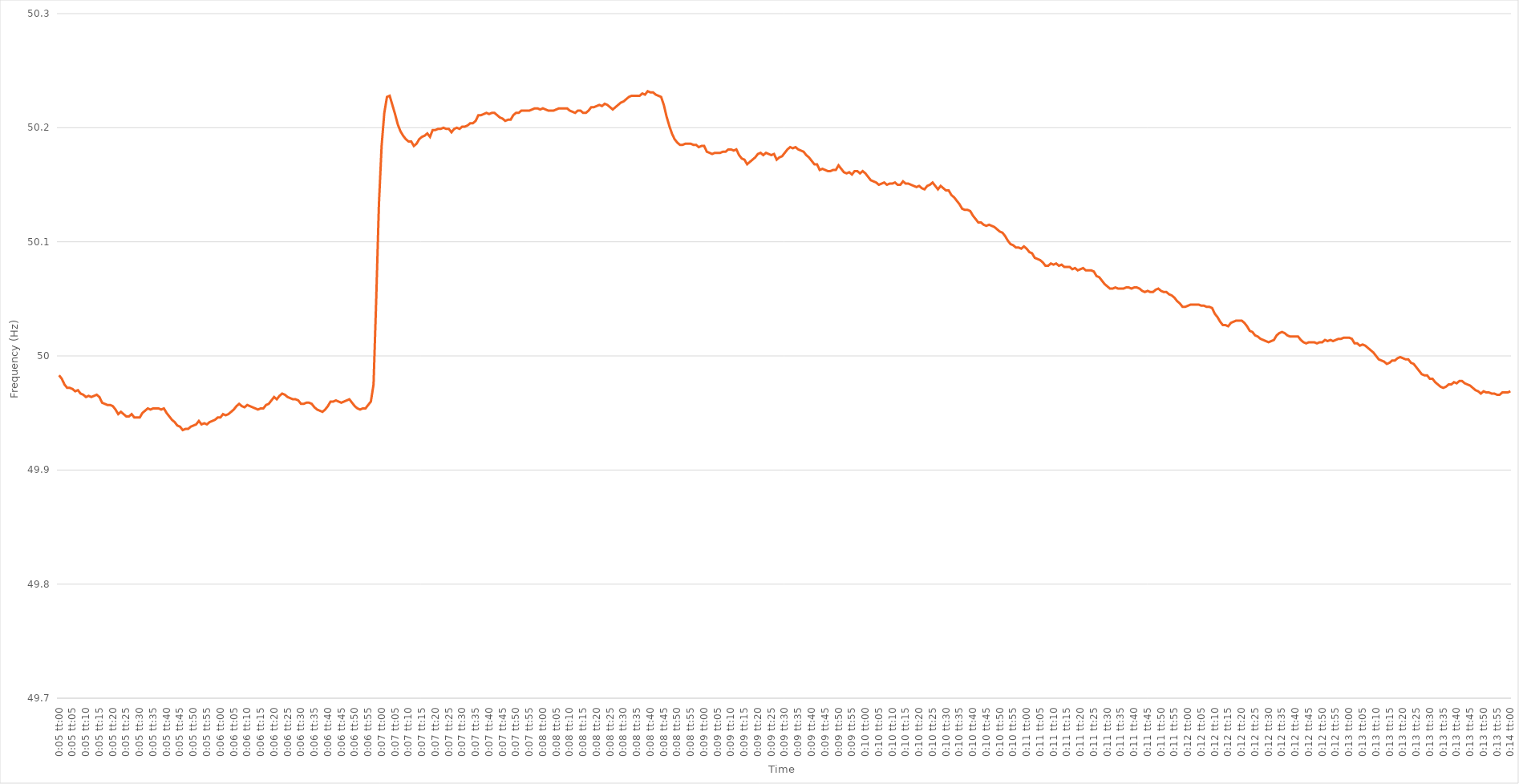
| Category | Series 0 |
|---|---|
| 0.003472222222222222 | 49.983 |
| 0.003483796296296296 | 49.98 |
| 0.0034953703703703705 | 49.975 |
| 0.0035069444444444445 | 49.972 |
| 0.0035185185185185185 | 49.972 |
| 0.003530092592592592 | 49.971 |
| 0.0035416666666666665 | 49.969 |
| 0.0035532407407407405 | 49.97 |
| 0.0035648148148148154 | 49.967 |
| 0.0035763888888888894 | 49.966 |
| 0.003587962962962963 | 49.964 |
| 0.003599537037037037 | 49.965 |
| 0.0036111111111111114 | 49.964 |
| 0.0036226851851851854 | 49.965 |
| 0.0036342592592592594 | 49.966 |
| 0.003645833333333333 | 49.964 |
| 0.0036574074074074074 | 49.959 |
| 0.0036689814814814814 | 49.958 |
| 0.0036805555555555554 | 49.957 |
| 0.00369212962962963 | 49.957 |
| 0.0037037037037037034 | 49.956 |
| 0.0037152777777777774 | 49.953 |
| 0.0037268518518518514 | 49.949 |
| 0.0037384259259259263 | 49.951 |
| 0.0037500000000000003 | 49.949 |
| 0.003761574074074074 | 49.947 |
| 0.0037731481481481483 | 49.947 |
| 0.0037847222222222223 | 49.949 |
| 0.0037962962962962963 | 49.946 |
| 0.0038078703703703707 | 49.946 |
| 0.0038194444444444443 | 49.946 |
| 0.0038310185185185183 | 49.95 |
| 0.0038425925925925923 | 49.952 |
| 0.0038541666666666668 | 49.954 |
| 0.0038657407407407408 | 49.953 |
| 0.0038773148148148143 | 49.954 |
| 0.0038888888888888883 | 49.954 |
| 0.003900462962962963 | 49.954 |
| 0.003912037037037037 | 49.953 |
| 0.003923611111111111 | 49.954 |
| 0.003935185185185186 | 49.95 |
| 0.003946759259259259 | 49.947 |
| 0.003958333333333334 | 49.944 |
| 0.003969907407407407 | 49.942 |
| 0.003981481481481482 | 49.939 |
| 0.003993055555555556 | 49.938 |
| 0.00400462962962963 | 49.935 |
| 0.004016203703703703 | 49.936 |
| 0.004027777777777778 | 49.936 |
| 0.004039351851851852 | 49.938 |
| 0.004050925925925926 | 49.939 |
| 0.004062499999999999 | 49.94 |
| 0.004074074074074075 | 49.943 |
| 0.004085648148148148 | 49.94 |
| 0.004097222222222223 | 49.941 |
| 0.004108796296296297 | 49.94 |
| 0.004120370370370371 | 49.942 |
| 0.004131944444444444 | 49.943 |
| 0.004143518518518519 | 49.944 |
| 0.004155092592592593 | 49.946 |
| 0.004166666666666667 | 49.946 |
| 0.00417824074074074 | 49.949 |
| 0.004189814814814815 | 49.948 |
| 0.004201388888888889 | 49.949 |
| 0.004212962962962963 | 49.951 |
| 0.004224537037037037 | 49.953 |
| 0.004236111111111111 | 49.956 |
| 0.004247685185185185 | 49.958 |
| 0.0042592592592592595 | 49.956 |
| 0.004270833333333334 | 49.955 |
| 0.0042824074074074075 | 49.957 |
| 0.004293981481481481 | 49.956 |
| 0.0043055555555555555 | 49.955 |
| 0.00431712962962963 | 49.954 |
| 0.0043287037037037035 | 49.953 |
| 0.004340277777777778 | 49.954 |
| 0.0043518518518518515 | 49.954 |
| 0.004363425925925926 | 49.957 |
| 0.0043749999999999995 | 49.958 |
| 0.004386574074074074 | 49.961 |
| 0.004398148148148148 | 49.964 |
| 0.004409722222222222 | 49.962 |
| 0.0044212962962962956 | 49.965 |
| 0.004432870370370371 | 49.967 |
| 0.0044444444444444444 | 49.966 |
| 0.004456018518518519 | 49.964 |
| 0.004467592592592593 | 49.963 |
| 0.004479166666666667 | 49.962 |
| 0.0044907407407407405 | 49.962 |
| 0.004502314814814815 | 49.961 |
| 0.004513888888888889 | 49.958 |
| 0.004525462962962963 | 49.958 |
| 0.0045370370370370365 | 49.959 |
| 0.004548611111111111 | 49.959 |
| 0.004560185185185185 | 49.958 |
| 0.004571759259259259 | 49.955 |
| 0.004583333333333333 | 49.953 |
| 0.004594907407407408 | 49.952 |
| 0.004606481481481481 | 49.951 |
| 0.004618055555555556 | 49.953 |
| 0.00462962962962963 | 49.956 |
| 0.004641203703703704 | 49.96 |
| 0.004652777777777777 | 49.96 |
| 0.004664351851851852 | 49.961 |
| 0.004675925925925926 | 49.96 |
| 0.0046875 | 49.959 |
| 0.004699074074074074 | 49.96 |
| 0.004710648148148148 | 49.961 |
| 0.004722222222222222 | 49.962 |
| 0.004733796296296296 | 49.959 |
| 0.00474537037037037 | 49.956 |
| 0.004756944444444445 | 49.954 |
| 0.004768518518518518 | 49.953 |
| 0.004780092592592592 | 49.954 |
| 0.004791666666666667 | 49.954 |
| 0.004803240740740741 | 49.957 |
| 0.004814814814814815 | 49.96 |
| 0.004826388888888889 | 49.975 |
| 0.004837962962962963 | 50.05 |
| 0.004849537037037037 | 50.133 |
| 0.004861111111111111 | 50.184 |
| 0.004872685185185186 | 50.213 |
| 0.004884259259259259 | 50.227 |
| 0.004895833333333333 | 50.228 |
| 0.004907407407407407 | 50.22 |
| 0.004918981481481482 | 50.212 |
| 0.004930555555555555 | 50.203 |
| 0.004942129629629629 | 50.197 |
| 0.004953703703703704 | 50.193 |
| 0.004965277777777778 | 50.19 |
| 0.004976851851851852 | 50.188 |
| 0.0049884259259259265 | 50.188 |
| 0.005 | 50.184 |
| 0.005011574074074074 | 50.186 |
| 0.005023148148148148 | 50.19 |
| 0.0050347222222222225 | 50.192 |
| 0.005046296296296296 | 50.193 |
| 0.0050578703703703706 | 50.195 |
| 0.005069444444444444 | 50.192 |
| 0.0050810185185185186 | 50.198 |
| 0.005092592592592592 | 50.198 |
| 0.005104166666666667 | 50.199 |
| 0.005115740740740741 | 50.199 |
| 0.005127314814814815 | 50.2 |
| 0.005138888888888889 | 50.199 |
| 0.0051504629629629635 | 50.199 |
| 0.005162037037037037 | 50.196 |
| 0.0051736111111111115 | 50.199 |
| 0.005185185185185185 | 50.2 |
| 0.0051967592592592595 | 50.199 |
| 0.005208333333333333 | 50.201 |
| 0.005219907407407407 | 50.201 |
| 0.005231481481481482 | 50.202 |
| 0.0052430555555555555 | 50.204 |
| 0.00525462962962963 | 50.204 |
| 0.0052662037037037035 | 50.206 |
| 0.005277777777777777 | 50.211 |
| 0.0052893518518518515 | 50.211 |
| 0.005300925925925925 | 50.212 |
| 0.0053125 | 50.213 |
| 0.005324074074074075 | 50.212 |
| 0.005335648148148148 | 50.213 |
| 0.005347222222222222 | 50.213 |
| 0.005358796296296296 | 50.211 |
| 0.00537037037037037 | 50.209 |
| 0.005381944444444445 | 50.208 |
| 0.005393518518518519 | 50.206 |
| 0.005405092592592592 | 50.207 |
| 0.005416666666666667 | 50.207 |
| 0.00542824074074074 | 50.211 |
| 0.005439814814814815 | 50.213 |
| 0.005451388888888888 | 50.213 |
| 0.005462962962962964 | 50.215 |
| 0.005474537037037037 | 50.215 |
| 0.005486111111111112 | 50.215 |
| 0.005497685185185185 | 50.215 |
| 0.005509259259259259 | 50.216 |
| 0.005520833333333333 | 50.217 |
| 0.005532407407407407 | 50.217 |
| 0.005543981481481482 | 50.216 |
| 0.005555555555555556 | 50.217 |
| 0.00556712962962963 | 50.216 |
| 0.005578703703703704 | 50.215 |
| 0.005590277777777778 | 50.215 |
| 0.005601851851851852 | 50.215 |
| 0.005613425925925927 | 50.216 |
| 0.005624999999999999 | 50.217 |
| 0.005636574074074074 | 50.217 |
| 0.005648148148148148 | 50.217 |
| 0.005659722222222222 | 50.217 |
| 0.005671296296296296 | 50.215 |
| 0.00568287037037037 | 50.214 |
| 0.005694444444444444 | 50.213 |
| 0.005706018518518519 | 50.215 |
| 0.005717592592592593 | 50.215 |
| 0.005729166666666667 | 50.213 |
| 0.005740740740740742 | 50.213 |
| 0.005752314814814814 | 50.215 |
| 0.005763888888888889 | 50.218 |
| 0.005775462962962962 | 50.218 |
| 0.005787037037037038 | 50.219 |
| 0.005798611111111111 | 50.22 |
| 0.005810185185185186 | 50.219 |
| 0.005821759259259259 | 50.221 |
| 0.005833333333333334 | 50.22 |
| 0.005844907407407407 | 50.218 |
| 0.0058564814814814825 | 50.216 |
| 0.005868055555555554 | 50.218 |
| 0.00587962962962963 | 50.22 |
| 0.005891203703703703 | 50.222 |
| 0.005902777777777778 | 50.223 |
| 0.005914351851851852 | 50.225 |
| 0.005925925925925926 | 50.227 |
| 0.005937500000000001 | 50.228 |
| 0.0059490740740740745 | 50.228 |
| 0.005960648148148149 | 50.228 |
| 0.0059722222222222225 | 50.228 |
| 0.005983796296296296 | 50.23 |
| 0.00599537037037037 | 50.229 |
| 0.006006944444444444 | 50.232 |
| 0.006018518518518518 | 50.231 |
| 0.006030092592592593 | 50.231 |
| 0.0060416666666666665 | 50.229 |
| 0.006053240740740741 | 50.228 |
| 0.0060648148148148145 | 50.227 |
| 0.006076388888888889 | 50.22 |
| 0.006087962962962964 | 50.21 |
| 0.006099537037037036 | 50.202 |
| 0.006111111111111111 | 50.195 |
| 0.006122685185185185 | 50.19 |
| 0.0061342592592592594 | 50.187 |
| 0.006145833333333333 | 50.185 |
| 0.0061574074074074074 | 50.185 |
| 0.006168981481481481 | 50.186 |
| 0.006180555555555556 | 50.186 |
| 0.00619212962962963 | 50.186 |
| 0.006203703703703704 | 50.185 |
| 0.006215277777777777 | 50.185 |
| 0.0062268518518518515 | 50.183 |
| 0.006238425925925925 | 50.184 |
| 0.0062499999999999995 | 50.184 |
| 0.006261574074074075 | 50.179 |
| 0.006273148148148148 | 50.178 |
| 0.006284722222222223 | 50.177 |
| 0.006296296296296296 | 50.178 |
| 0.006307870370370371 | 50.178 |
| 0.006319444444444444 | 50.178 |
| 0.00633101851851852 | 50.179 |
| 0.0063425925925925915 | 50.179 |
| 0.006354166666666667 | 50.181 |
| 0.00636574074074074 | 50.181 |
| 0.006377314814814815 | 50.18 |
| 0.006388888888888888 | 50.181 |
| 0.006400462962962963 | 50.176 |
| 0.006412037037037036 | 50.173 |
| 0.006423611111111112 | 50.172 |
| 0.006435185185185186 | 50.168 |
| 0.00644675925925926 | 50.17 |
| 0.006458333333333333 | 50.172 |
| 0.006469907407407407 | 50.174 |
| 0.006481481481481481 | 50.177 |
| 0.006493055555555555 | 50.178 |
| 0.00650462962962963 | 50.176 |
| 0.006516203703703704 | 50.178 |
| 0.006527777777777778 | 50.177 |
| 0.006539351851851852 | 50.176 |
| 0.006550925925925926 | 50.177 |
| 0.0065625 | 50.172 |
| 0.006574074074074073 | 50.174 |
| 0.006585648148148147 | 50.175 |
| 0.006597222222222222 | 50.178 |
| 0.006608796296296297 | 50.181 |
| 0.00662037037037037 | 50.183 |
| 0.006631944444444445 | 50.182 |
| 0.006643518518518518 | 50.183 |
| 0.0066550925925925935 | 50.181 |
| 0.006666666666666667 | 50.18 |
| 0.0066782407407407415 | 50.179 |
| 0.006689814814814814 | 50.176 |
| 0.006701388888888889 | 50.174 |
| 0.006712962962962962 | 50.171 |
| 0.006724537037037037 | 50.168 |
| 0.00673611111111111 | 50.168 |
| 0.0067476851851851856 | 50.163 |
| 0.006759259259259259 | 50.164 |
| 0.0067708333333333336 | 50.163 |
| 0.006782407407407408 | 50.162 |
| 0.006793981481481482 | 50.162 |
| 0.006805555555555557 | 50.163 |
| 0.006817129629629629 | 50.163 |
| 0.006828703703703704 | 50.167 |
| 0.006840277777777778 | 50.164 |
| 0.006851851851851852 | 50.161 |
| 0.006863425925925926 | 50.16 |
| 0.006875 | 50.161 |
| 0.006886574074074074 | 50.159 |
| 0.006898148148148149 | 50.162 |
| 0.0069097222222222225 | 50.162 |
| 0.006921296296296297 | 50.16 |
| 0.00693287037037037 | 50.162 |
| 0.006944444444444444 | 50.16 |
| 0.0069560185185185185 | 50.157 |
| 0.006967592592592592 | 50.154 |
| 0.006979166666666667 | 50.153 |
| 0.006990740740740741 | 50.152 |
| 0.007002314814814815 | 50.15 |
| 0.007013888888888889 | 50.151 |
| 0.007025462962962963 | 50.152 |
| 0.007037037037037037 | 50.15 |
| 0.0070486111111111105 | 50.151 |
| 0.007060185185185184 | 50.151 |
| 0.007071759259259259 | 50.152 |
| 0.007083333333333333 | 50.15 |
| 0.007094907407407407 | 50.15 |
| 0.007106481481481481 | 50.153 |
| 0.007118055555555555 | 50.151 |
| 0.007129629629629631 | 50.151 |
| 0.007141203703703704 | 50.15 |
| 0.007152777777777779 | 50.149 |
| 0.0071643518518518514 | 50.148 |
| 0.007175925925925926 | 50.149 |
| 0.0071874999999999994 | 50.147 |
| 0.007199074074074074 | 50.146 |
| 0.0072106481481481475 | 50.149 |
| 0.007222222222222223 | 50.15 |
| 0.007233796296296296 | 50.152 |
| 0.007245370370370371 | 50.149 |
| 0.007256944444444444 | 50.146 |
| 0.007268518518518519 | 50.149 |
| 0.0072800925925925915 | 50.147 |
| 0.007291666666666666 | 50.145 |
| 0.007303240740740741 | 50.145 |
| 0.007314814814814815 | 50.141 |
| 0.007326388888888889 | 50.139 |
| 0.007337962962962963 | 50.136 |
| 0.007349537037037037 | 50.133 |
| 0.007361111111111111 | 50.129 |
| 0.007372685185185186 | 50.128 |
| 0.00738425925925926 | 50.128 |
| 0.007395833333333334 | 50.127 |
| 0.007407407407407407 | 50.123 |
| 0.007418981481481481 | 50.12 |
| 0.007430555555555555 | 50.117 |
| 0.007442129629629629 | 50.117 |
| 0.007453703703703703 | 50.115 |
| 0.007465277777777778 | 50.114 |
| 0.007476851851851853 | 50.115 |
| 0.007488425925925926 | 50.114 |
| 0.007500000000000001 | 50.113 |
| 0.007511574074074074 | 50.111 |
| 0.007523148148148148 | 50.109 |
| 0.007534722222222221 | 50.108 |
| 0.007546296296296297 | 50.105 |
| 0.00755787037037037 | 50.101 |
| 0.007569444444444445 | 50.098 |
| 0.007581018518518518 | 50.097 |
| 0.007592592592592593 | 50.095 |
| 0.007604166666666666 | 50.095 |
| 0.0076157407407407415 | 50.094 |
| 0.007627314814814815 | 50.096 |
| 0.007638888888888889 | 50.094 |
| 0.007650462962962963 | 50.091 |
| 0.007662037037037037 | 50.09 |
| 0.007673611111111111 | 50.086 |
| 0.007685185185185185 | 50.085 |
| 0.00769675925925926 | 50.084 |
| 0.0077083333333333335 | 50.082 |
| 0.007719907407407408 | 50.079 |
| 0.0077314814814814815 | 50.079 |
| 0.007743055555555556 | 50.081 |
| 0.007754629629629629 | 50.08 |
| 0.007766203703703703 | 50.081 |
| 0.007777777777777777 | 50.079 |
| 0.007789351851851852 | 50.08 |
| 0.0078009259259259256 | 50.078 |
| 0.0078125 | 50.078 |
| 0.007824074074074075 | 50.078 |
| 0.007835648148148149 | 50.076 |
| 0.007847222222222222 | 50.077 |
| 0.007858796296296296 | 50.075 |
| 0.007870370370370371 | 50.076 |
| 0.007881944444444443 | 50.077 |
| 0.007893518518518518 | 50.075 |
| 0.007905092592592592 | 50.075 |
| 0.007916666666666667 | 50.075 |
| 0.007928240740740741 | 50.074 |
| 0.007939814814814814 | 50.07 |
| 0.007951388888888888 | 50.069 |
| 0.007962962962962963 | 50.066 |
| 0.007974537037037037 | 50.063 |
| 0.007986111111111112 | 50.061 |
| 0.007997685185185186 | 50.059 |
| 0.00800925925925926 | 50.059 |
| 0.008020833333333333 | 50.06 |
| 0.008032407407407407 | 50.059 |
| 0.008043981481481482 | 50.059 |
| 0.008055555555555555 | 50.059 |
| 0.00806712962962963 | 50.06 |
| 0.008078703703703704 | 50.06 |
| 0.008090277777777778 | 50.059 |
| 0.008101851851851851 | 50.06 |
| 0.008113425925925925 | 50.06 |
| 0.008124999999999999 | 50.059 |
| 0.008136574074074074 | 50.057 |
| 0.008148148148148147 | 50.056 |
| 0.008159722222222223 | 50.057 |
| 0.008171296296296296 | 50.056 |
| 0.00818287037037037 | 50.056 |
| 0.008194444444444445 | 50.058 |
| 0.008206018518518519 | 50.059 |
| 0.008217592592592594 | 50.057 |
| 0.008229166666666666 | 50.056 |
| 0.008240740740740741 | 50.056 |
| 0.008252314814814815 | 50.054 |
| 0.008263888888888888 | 50.053 |
| 0.008275462962962962 | 50.051 |
| 0.008287037037037037 | 50.048 |
| 0.00829861111111111 | 50.046 |
| 0.008310185185185186 | 50.043 |
| 0.00832175925925926 | 50.043 |
| 0.008333333333333333 | 50.044 |
| 0.008344907407407409 | 50.045 |
| 0.00835648148148148 | 50.045 |
| 0.008368055555555556 | 50.045 |
| 0.00837962962962963 | 50.045 |
| 0.008391203703703705 | 50.044 |
| 0.008402777777777778 | 50.044 |
| 0.008414351851851852 | 50.043 |
| 0.008425925925925925 | 50.043 |
| 0.0084375 | 50.042 |
| 0.008449074074074074 | 50.037 |
| 0.00846064814814815 | 50.034 |
| 0.008472222222222221 | 50.03 |
| 0.008483796296296297 | 50.027 |
| 0.00849537037037037 | 50.027 |
| 0.008506944444444444 | 50.026 |
| 0.008518518518518519 | 50.029 |
| 0.008530092592592593 | 50.03 |
| 0.008541666666666668 | 50.031 |
| 0.008553240740740741 | 50.031 |
| 0.008564814814814815 | 50.031 |
| 0.008576388888888889 | 50.029 |
| 0.008587962962962962 | 50.026 |
| 0.008599537037037036 | 50.022 |
| 0.008611111111111111 | 50.021 |
| 0.008622685185185185 | 50.018 |
| 0.00863425925925926 | 50.017 |
| 0.008645833333333333 | 50.015 |
| 0.008657407407407407 | 50.014 |
| 0.00866898148148148 | 50.013 |
| 0.008680555555555556 | 50.012 |
| 0.008692129629629631 | 50.013 |
| 0.008703703703703703 | 50.014 |
| 0.008715277777777778 | 50.018 |
| 0.008726851851851852 | 50.02 |
| 0.008738425925925926 | 50.021 |
| 0.008749999999999999 | 50.02 |
| 0.008761574074074074 | 50.018 |
| 0.008773148148148148 | 50.017 |
| 0.008784722222222223 | 50.017 |
| 0.008796296296296297 | 50.017 |
| 0.00880787037037037 | 50.017 |
| 0.008819444444444444 | 50.014 |
| 0.008831018518518518 | 50.012 |
| 0.008842592592592591 | 50.011 |
| 0.008854166666666666 | 50.012 |
| 0.008865740740740742 | 50.012 |
| 0.008877314814814815 | 50.012 |
| 0.008888888888888889 | 50.011 |
| 0.008900462962962962 | 50.012 |
| 0.008912037037037038 | 50.012 |
| 0.008923611111111111 | 50.014 |
| 0.008935185185185187 | 50.013 |
| 0.008946759259259258 | 50.014 |
| 0.008958333333333334 | 50.013 |
| 0.008969907407407407 | 50.014 |
| 0.008981481481481481 | 50.015 |
| 0.008993055555555554 | 50.015 |
| 0.00900462962962963 | 50.016 |
| 0.009016203703703703 | 50.016 |
| 0.009027777777777779 | 50.016 |
| 0.009039351851851852 | 50.015 |
| 0.009050925925925926 | 50.011 |
| 0.0090625 | 50.011 |
| 0.009074074074074073 | 50.009 |
| 0.009085648148148148 | 50.01 |
| 0.009097222222222222 | 50.009 |
| 0.009108796296296297 | 50.007 |
| 0.00912037037037037 | 50.005 |
| 0.009131944444444444 | 50.003 |
| 0.009143518518518518 | 50 |
| 0.009155092592592593 | 49.997 |
| 0.009166666666666667 | 49.996 |
| 0.00917824074074074 | 49.995 |
| 0.009189814814814814 | 49.993 |
| 0.00920138888888889 | 49.994 |
| 0.009212962962962963 | 49.996 |
| 0.009224537037037036 | 49.996 |
| 0.009236111111111112 | 49.998 |
| 0.009247685185185185 | 49.999 |
| 0.00925925925925926 | 49.998 |
| 0.009270833333333334 | 49.997 |
| 0.009282407407407408 | 49.997 |
| 0.009293981481481481 | 49.994 |
| 0.009305555555555555 | 49.993 |
| 0.009317129629629628 | 49.99 |
| 0.009328703703703704 | 49.987 |
| 0.009340277777777777 | 49.984 |
| 0.009351851851851853 | 49.983 |
| 0.009363425925925926 | 49.983 |
| 0.009375 | 49.98 |
| 0.009386574074074075 | 49.98 |
| 0.009398148148148149 | 49.977 |
| 0.009409722222222224 | 49.975 |
| 0.009421296296296296 | 49.973 |
| 0.009432870370370371 | 49.972 |
| 0.009444444444444445 | 49.973 |
| 0.009456018518518518 | 49.975 |
| 0.009467592592592592 | 49.975 |
| 0.009479166666666667 | 49.977 |
| 0.00949074074074074 | 49.976 |
| 0.009502314814814816 | 49.978 |
| 0.00951388888888889 | 49.978 |
| 0.009525462962962963 | 49.976 |
| 0.009537037037037037 | 49.975 |
| 0.00954861111111111 | 49.974 |
| 0.009560185185185185 | 49.972 |
| 0.009571759259259259 | 49.97 |
| 0.009583333333333334 | 49.969 |
| 0.009594907407407408 | 49.967 |
| 0.009606481481481481 | 49.969 |
| 0.009618055555555555 | 49.968 |
| 0.00962962962962963 | 49.968 |
| 0.009641203703703704 | 49.967 |
| 0.009652777777777777 | 49.967 |
| 0.009664351851851851 | 49.966 |
| 0.009675925925925926 | 49.966 |
| 0.0096875 | 49.968 |
| 0.009699074074074074 | 49.968 |
| 0.009710648148148147 | 49.968 |
| 0.009722222222222222 | 49.969 |